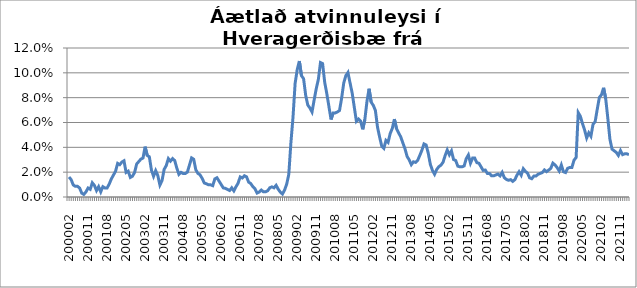
| Category | Series 0 |
|---|---|
| 200002 | 0.016 |
| 200003 | 0.014 |
| 200004 | 0.01 |
| 200005 | 0.009 |
| 200006 | 0.009 |
| 200007 | 0.007 |
| 200008 | 0.003 |
| 200009 | 0.002 |
| 200010 | 0.004 |
| 200011 | 0.007 |
| 200012 | 0.006 |
| 200101 | 0.011 |
| 200102 | 0.009 |
| 200103 | 0.005 |
| 200104 | 0.008 |
| 200105 | 0.004 |
| 200106 | 0.008 |
| 200107 | 0.007 |
| 200108 | 0.007 |
| 200109 | 0.01 |
| 200110 | 0.015 |
| 200111 | 0.018 |
| 200112 | 0.021 |
| 200201 | 0.027 |
| 200202 | 0.026 |
| 200203 | 0.028 |
| 200204 | 0.029 |
| 200205 | 0.02 |
| 200206 | 0.021 |
| 200207 | 0.016 |
| 200208 | 0.017 |
| 200209 | 0.02 |
| 200210 | 0.027 |
| 200211 | 0.029 |
| 200212 | 0.031 |
| 200301 | 0.031 |
| 200302 | 0.041 |
| 200303 | 0.033 |
| 200304 | 0.032 |
| 200305 | 0.022 |
| 200306 | 0.017 |
| 200307 | 0.021 |
| 200308 | 0.017 |
| 200309 | 0.01 |
| 200310 | 0.013 |
| 200311 | 0.022 |
| 200312 | 0.025 |
| 200401 | 0.031 |
| 200402 | 0.029 |
| 200403 | 0.031 |
| 200404 | 0.029 |
| 200405 | 0.023 |
| 200406 | 0.018 |
| 200407 | 0.02 |
| 200408 | 0.019 |
| 200409 | 0.019 |
| 200410 | 0.02 |
| 200411 | 0.026 |
| 200412 | 0.031 |
| 200501 | 0.03 |
| 200502 | 0.022 |
| 200503 | 0.019 |
| 200504 | 0.018 |
| 200505 | 0.015 |
| 200506 | 0.011 |
| 200507 | 0.011 |
| 200508 | 0.01 |
| 200509 | 0.01 |
| 200510 | 0.009 |
| 200511 | 0.015 |
| 200512 | 0.016 |
| 200601 | 0.013 |
| 200602 | 0.01 |
| 200603 | 0.007 |
| 200604 | 0.007 |
| 200605 | 0.006 |
| 200606 | 0.005 |
| 200607 | 0.007 |
| 200608 | 0.005 |
| 200609 | 0.008 |
| 200610 | 0.011 |
| 200611 | 0.016 |
| 200612 | 0.015 |
| 200701 | 0.017 |
| 200702 | 0.016 |
| 200703 | 0.012 |
| 200704 | 0.011 |
| 200705 | 0.008 |
| 200706 | 0.007 |
| 200707 | 0.003 |
| 200708 | 0.004 |
| 200709 | 0.006 |
| 200710 | 0.004 |
| 200711 | 0.004 |
| 200712 | 0.005 |
| 200801 | 0.007 |
| 200802 | 0.008 |
| 200803 | 0.007 |
| 200804 | 0.009 |
| 200805 | 0.006 |
| 200806 | 0.004 |
| 200807 | 0.002 |
| 200808 | 0.006 |
| 200809 | 0.01 |
| 200810 | 0.018 |
| 200811 | 0.044 |
| 200812 | 0.064 |
| 200901 | 0.092 |
| 200902 | 0.103 |
| 200903 | 0.109 |
| 200904 | 0.098 |
| 200905 | 0.095 |
| 200906 | 0.082 |
| 200907 | 0.074 |
| 200908 | 0.072 |
| 200909 | 0.068 |
| 200910 | 0.078 |
| 200911 | 0.087 |
| 200912 | 0.095 |
| 201001 | 0.108 |
| 201002 | 0.107 |
| 201003 | 0.092 |
| 201004 | 0.083 |
| 201005 | 0.073 |
| 201006 | 0.062 |
| 201007 | 0.068 |
| 201008 | 0.068 |
| 201009 | 0.068 |
| 201010 | 0.07 |
| 201011 | 0.079 |
| 201012 | 0.092 |
| 201101 | 0.098 |
| 201102 | 0.1 |
| 201103 | 0.092 |
| 201104 | 0.084 |
| 201105 | 0.072 |
| 201106 | 0.061 |
| 201107 | 0.063 |
| 201108 | 0.061 |
| 201109 | 0.055 |
| 201110 | 0.062 |
| 201111 | 0.077 |
| 201112 | 0.087 |
| 201201 | 0.076 |
| 201202 | 0.074 |
| 201203 | 0.07 |
| 201204 | 0.056 |
| 201205 | 0.048 |
| 201206 | 0.041 |
| 201207 | 0.039 |
| 201208 | 0.046 |
| 201209 | 0.044 |
| 201210 | 0.051 |
| 201211 | 0.055 |
| 201212 | 0.063 |
| 201301 | 0.055 |
| 201302 | 0.052 |
| 201303 | 0.048 |
| 201304 | 0.044 |
| 201305 | 0.039 |
| 201306 | 0.033 |
| 201307 | 0.03 |
| 201308 | 0.026 |
| 201309 | 0.028 |
| 201310 | 0.028 |
| 201311 | 0.029 |
| 201312 | 0.033 |
| 201401 | 0.038 |
| 201402 | 0.043 |
| 201403 | 0.042 |
| 201404 | 0.035 |
| 201405 | 0.026 |
| 201406 | 0.021 |
| 201407 | 0.018 |
| 201408 | 0.022 |
| 201409 | 0.024 |
| 201410 | 0.026 |
| 201411 | 0.028 |
| 201412 | 0.033 |
| 201501 | 0.038 |
| 201502 | 0.034 |
| 201503 | 0.037 |
| 201504 | 0.03 |
| 201505 | 0.029 |
| 201506 | 0.025 |
| 201507 | 0.024 |
| 201508 | 0.024 |
| 201509 | 0.025 |
| 201510 | 0.031 |
| 201511 | 0.034 |
| 201512 | 0.027 |
| 201601 | 0.031 |
| 201602 | 0.031 |
| 201603 | 0.028 |
| 201604 | 0.027 |
| 201605 | 0.024 |
| 201606 | 0.021 |
| 201607 | 0.022 |
| 201608 | 0.019 |
| 201609 | 0.019 |
| 201610 | 0.017 |
| 201611 | 0.017 |
| 201612 | 0.018 |
| 201701 | 0.018 |
| 201702 | 0.017 |
| 201703 | 0.02 |
| 201704 | 0.016 |
| 201705 | 0.014 |
| 201706 | 0.013 |
| 201707 | 0.014 |
| 201708 | 0.013 |
| 201709 | 0.014 |
| 201710 | 0.018 |
| 201711 | 0.02 |
| 201712 | 0.018 |
| 201801 | 0.023 |
| 201802 | 0.021 |
| 201803 | 0.019 |
| 201804 | 0.015 |
| 201805 | 0.015 |
| 201806 | 0.017 |
| 201807 | 0.017 |
| 201808 | 0.018 |
| 201809 | 0.019 |
| 201810 | 0.02 |
| 201811 | 0.022 |
| 201812 | 0.02 |
| 201901 | 0.022 |
| 201902 | 0.023 |
| 201903 | 0.027 |
| 201904 | 0.026 |
| 201905 | 0.024 |
| 201906 | 0.021 |
| 201907 | 0.026 |
| 201908 | 0.02 |
| 201909 | 0.02 |
| 201910 | 0.023 |
| 201911 | 0.024 |
| 201912 | 0.024 |
| 202001 | 0.03 |
| 202002 | 0.032 |
| 202003 | 0.068 |
| 202004 | 0.065 |
| 202005 | 0.059 |
| 202006 | 0.054 |
| 202007 | 0.048 |
| 202008 | 0.052 |
| 202009 | 0.049 |
| 202010 | 0.059 |
| 202011 | 0.061 |
| 202012 | 0.071 |
| 202101 | 0.08 |
| 202102 | 0.082 |
| 202103 | 0.088 |
| 202104 | 0.079 |
| 202105 | 0.063 |
| 202106 | 0.046 |
| 202107 | 0.039 |
| 202108 | 0.037 |
| 202109 | 0.036 |
| 202110 | 0.033 |
| 202111 | 0.037 |
| 202112 | 0.034 |
| 202201 | 0.035 |
| 202202 | 0.035 |
| 202203 | 0.034 |